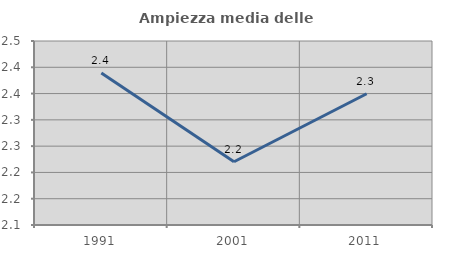
| Category | Ampiezza media delle famiglie |
|---|---|
| 1991.0 | 2.389 |
| 2001.0 | 2.22 |
| 2011.0 | 2.35 |